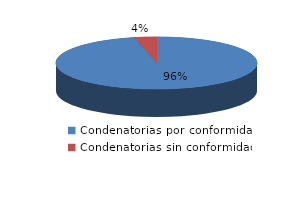
| Category | Series 0 |
|---|---|
| 0 | 995 |
| 1 | 37 |